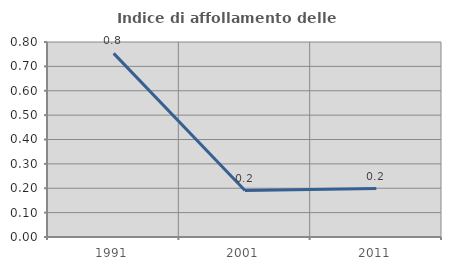
| Category | Indice di affollamento delle abitazioni  |
|---|---|
| 1991.0 | 0.753 |
| 2001.0 | 0.19 |
| 2011.0 | 0.199 |